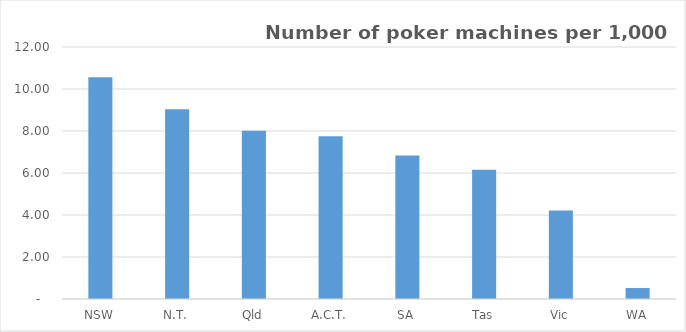
| Category | Series 0 |
|---|---|
| NSW | 10.555 |
| N.T. | 9.042 |
| Qld | 8.011 |
| A.C.T. | 7.749 |
| SA | 6.835 |
| Tas | 6.15 |
| Vic | 4.217 |
| WA | 0.521 |